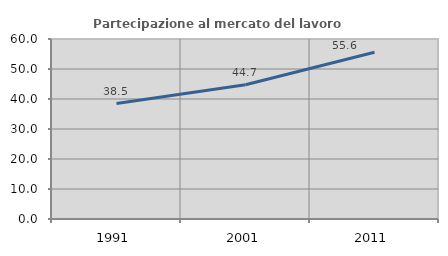
| Category | Partecipazione al mercato del lavoro  femminile |
|---|---|
| 1991.0 | 38.486 |
| 2001.0 | 44.724 |
| 2011.0 | 55.603 |